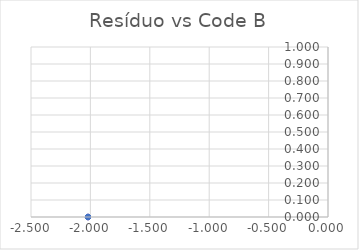
| Category | Series 0 |
|---|---|
| -2.0206666666666666 | 0 |
| -2.0206666666666666 | 0 |
| -2.0206666666666666 | 0 |
| -2.0206666666666666 | 0 |
| -2.0206666666666666 | 0 |
| -2.0206666666666666 | 0 |
| -2.0206666666666666 | 0 |
| -2.0206666666666666 | 0 |
| -2.0206666666666666 | 0 |
| -2.0206666666666666 | 0 |
| -2.0206666666666666 | 0 |
| -2.0206666666666666 | 0 |
| -2.0206666666666666 | 0 |
| -2.0206666666666666 | 0 |
| -2.0206666666666666 | 0 |
| -2.0206666666666666 | 0 |
| -2.0206666666666666 | 0 |
| -2.0206666666666666 | 0 |
| -2.0206666666666666 | 0 |
| -2.0206666666666666 | 0 |
| -2.0206666666666666 | 0 |
| -2.0206666666666666 | 0 |
| -2.0206666666666666 | 0 |
| -2.0206666666666666 | 0 |
| -2.0206666666666666 | 0 |
| -2.0206666666666666 | 0 |
| -2.0206666666666666 | 0 |
| -2.0206666666666666 | 0 |
| -2.0206666666666666 | 0 |
| -2.0206666666666666 | 0 |
| -2.0206666666666666 | 0 |
| -2.0206666666666666 | 0 |
| -2.0206666666666666 | 0 |
| -2.0206666666666666 | 0 |
| -2.0206666666666666 | 0 |
| -2.0206666666666666 | 0 |
| -2.0206666666666666 | 0 |
| -2.0206666666666666 | 0 |
| -2.0206666666666666 | 0 |
| -2.0206666666666666 | 0 |
| -2.0206666666666666 | 0 |
| -2.0206666666666666 | 0 |
| -2.0206666666666666 | 0 |
| -2.0206666666666666 | 0 |
| -2.0206666666666666 | 0 |
| -2.0206666666666666 | 0 |
| -2.0206666666666666 | 0 |
| -2.0206666666666666 | 0 |
| -2.0206666666666666 | 0 |
| -2.0206666666666666 | 0 |
| -2.0206666666666666 | 0 |
| -2.0206666666666666 | 0 |
| -2.0206666666666666 | 0 |
| -2.0206666666666666 | 0 |
| -2.0206666666666666 | 0 |
| -2.0206666666666666 | 0 |
| -2.0206666666666666 | 0 |
| -2.0206666666666666 | 0 |
| -2.0206666666666666 | 0 |
| -2.0206666666666666 | 0 |
| -2.0206666666666666 | 0 |
| -2.0206666666666666 | 0 |
| -2.0206666666666666 | 0 |
| -2.0206666666666666 | 0 |
| -2.0206666666666666 | 0 |
| -2.0206666666666666 | 0 |
| -2.0206666666666666 | 0 |
| -2.0206666666666666 | 0 |